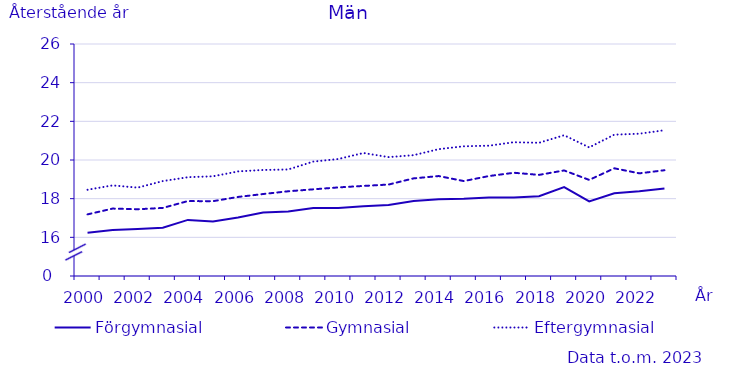
| Category | Förgymnasial | Gymnasial | Eftergymnasial |
|---|---|---|---|
| 2000.0 | 16.235 | 17.187 | 18.462 |
| 2001.0 | 16.382 | 17.487 | 18.686 |
| 2002.0 | 16.431 | 17.452 | 18.571 |
| 2003.0 | 16.497 | 17.521 | 18.91 |
| 2004.0 | 16.902 | 17.875 | 19.111 |
| 2005.0 | 16.817 | 17.87 | 19.157 |
| 2006.0 | 17.022 | 18.089 | 19.41 |
| 2007.0 | 17.28 | 18.24 | 19.485 |
| 2008.0 | 17.342 | 18.382 | 19.509 |
| 2009.0 | 17.518 | 18.483 | 19.918 |
| 2010.0 | 17.52 | 18.583 | 20.052 |
| 2011.0 | 17.607 | 18.659 | 20.362 |
| 2012.0 | 17.67 | 18.73 | 20.15 |
| 2013.0 | 17.88 | 19.05 | 20.25 |
| 2014.0 | 17.97 | 19.17 | 20.56 |
| 2015.0 | 18 | 18.91 | 20.71 |
| 2016.0 | 18.06 | 19.17 | 20.74 |
| 2017.0 | 18.06 | 19.34 | 20.92 |
| 2018.0 | 18.13 | 19.23 | 20.89 |
| 2019.0 | 18.6 | 19.46 | 21.28 |
| 2020.0 | 17.86 | 18.97 | 20.65 |
| 2021.0 | 18.28 | 19.57 | 21.31 |
| 2022.0 | 18.38 | 19.31 | 21.36 |
| 2023.0 | 18.53 | 19.47 | 21.54 |